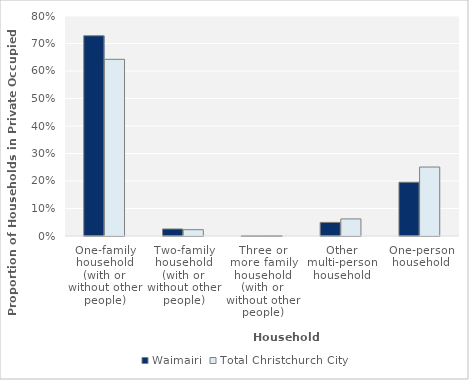
| Category | Waimairi | Total Christchurch City |
|---|---|---|
| One-family household (with or without other people) | 0.728 |  |
| Two-family household (with or without other people) | 0.026 |  |
| Three or more family household (with or without other people) | 0.001 |  |
| Other multi-person household | 0.049 |  |
| One-person household | 0.196 |  |